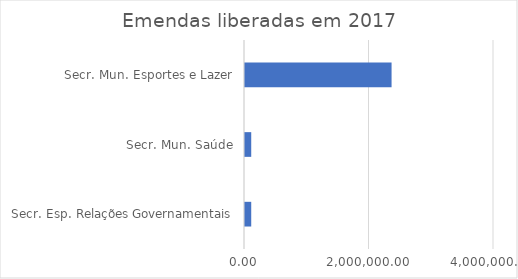
| Category | Valor |
|---|---|
| Secr. Esp. Relações Governamentais | 100000 |
| Secr. Mun. Saúde | 100000 |
| Secr. Mun. Esportes e Lazer | 2354544 |